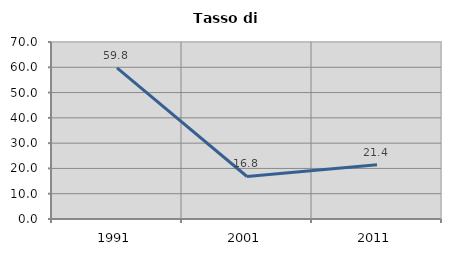
| Category | Tasso di disoccupazione   |
|---|---|
| 1991.0 | 59.801 |
| 2001.0 | 16.808 |
| 2011.0 | 21.417 |